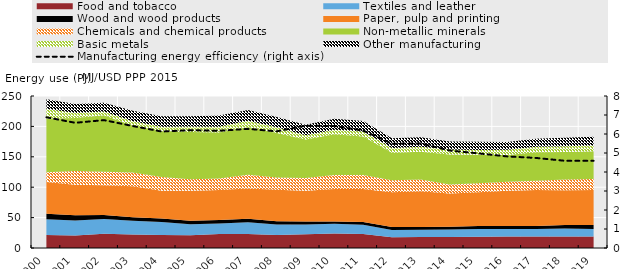
| Category | Manufacturing energy efficiency (right axis) |
|---|---|
| 2000.0 | 6.88 |
| 2001.0 | 6.59 |
| 2002.0 | 6.73 |
| 2003.0 | 6.42 |
| 2004.0 | 6.13 |
| 2005.0 | 6.2 |
| 2006.0 | 6.17 |
| 2007.0 | 6.27 |
| 2008.0 | 6.14 |
| 2009.0 | 6.44 |
| 2010.0 | 6.42 |
| 2011.0 | 6.18 |
| 2012.0 | 5.49 |
| 2013.0 | 5.5 |
| 2014.0 | 5.13 |
| 2015.0 | 4.98 |
| 2016.0 | 4.82 |
| 2017.0 | 4.74 |
| 2018.0 | 4.59 |
| 2019.0 | 4.59 |